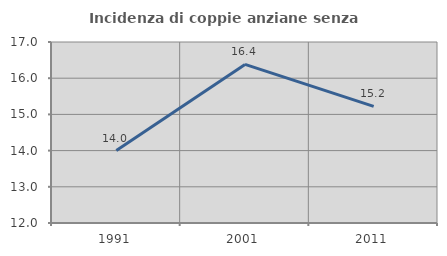
| Category | Incidenza di coppie anziane senza figli  |
|---|---|
| 1991.0 | 14.002 |
| 2001.0 | 16.382 |
| 2011.0 | 15.221 |